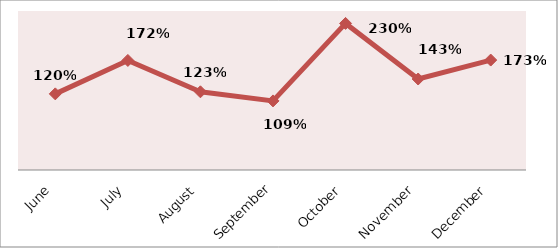
| Category | PERCENTAGE |
|---|---|
| June | 1.197 |
| July | 1.723 |
| August | 1.229 |
| September | 1.086 |
| October | 2.305 |
| November | 1.431 |
| December | 1.729 |